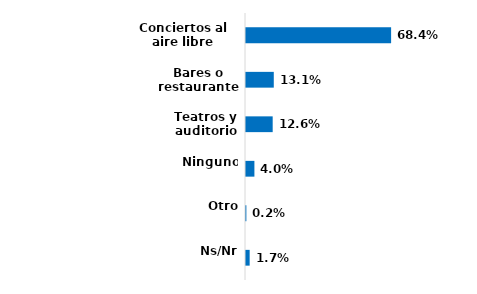
| Category | Series 0 |
|---|---|
| Conciertos al aire libre | 0.684 |
| Bares o restaurantes | 0.131 |
| Teatros y auditorios | 0.126 |
| Ninguno | 0.04 |
| Otro | 0.002 |
| Ns/Nr | 0.017 |